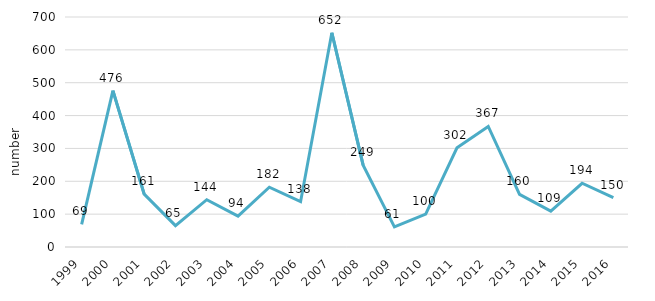
| Category | Number of fires |
|---|---|
| 1999.0 | 69 |
| 2000.0 | 476 |
| 2001.0 | 161 |
| 2002.0 | 65 |
| 2003.0 | 144 |
| 2004.0 | 94 |
| 2005.0 | 182 |
| 2006.0 | 138 |
| 2007.0 | 652 |
| 2008.0 | 249 |
| 2009.0 | 61 |
| 2010.0 | 100 |
| 2011.0 | 302 |
| 2012.0 | 367 |
| 2013.0 | 160 |
| 2014.0 | 109 |
| 2015.0 | 194 |
| 2016.0 | 150 |